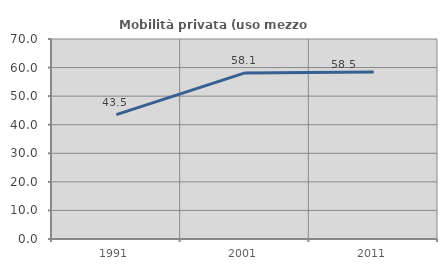
| Category | Mobilità privata (uso mezzo privato) |
|---|---|
| 1991.0 | 43.543 |
| 2001.0 | 58.13 |
| 2011.0 | 58.488 |